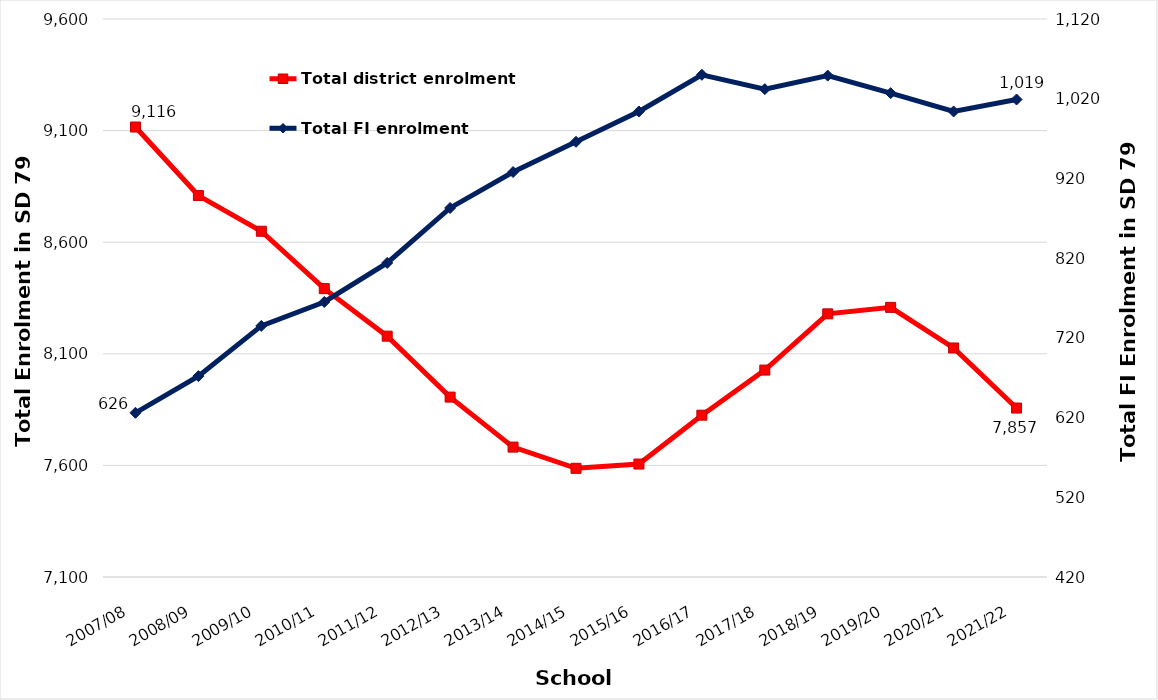
| Category | Total district enrolment  |
|---|---|
| 2007/08 | 9116 |
| 2008/09 | 8809 |
| 2009/10 | 8649 |
| 2010/11 | 8392 |
| 2011/12 | 8179 |
| 2012/13 | 7906 |
| 2013/14 | 7682 |
| 2014/15 | 7587 |
| 2015/16 | 7606 |
| 2016/17 | 7825 |
| 2017/18 | 8027 |
| 2018/19 | 8279 |
| 2019/20 | 8308 |
| 2020/21 | 8126 |
| 2021/22 | 7857 |